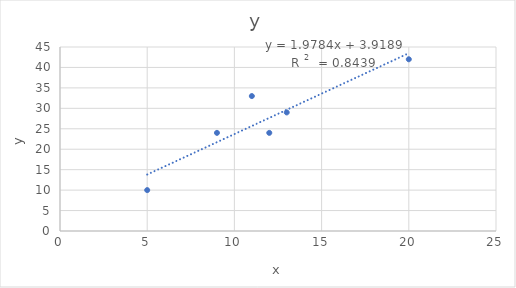
| Category | y |
|---|---|
| 9.0 | 24 |
| 11.0 | 33 |
| 5.0 | 10 |
| 13.0 | 29 |
| 20.0 | 42 |
| 12.0 | 24 |